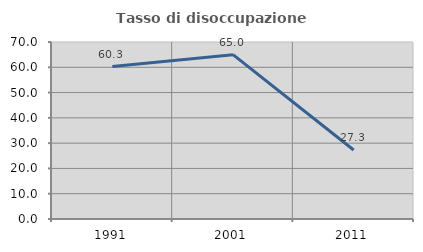
| Category | Tasso di disoccupazione giovanile  |
|---|---|
| 1991.0 | 60.274 |
| 2001.0 | 65 |
| 2011.0 | 27.273 |